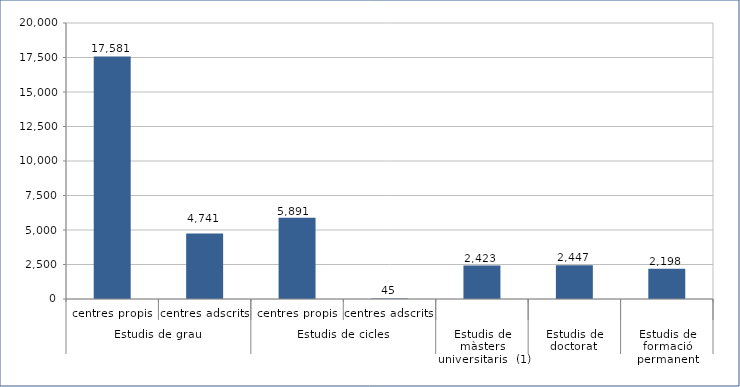
| Category | Series 0 |
|---|---|
| 0 | 17581 |
| 1 | 4741 |
| 2 | 5891 |
| 3 | 45 |
| 4 | 2423 |
| 5 | 2447 |
| 6 | 2198 |